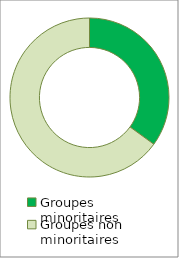
| Category | Series 0 |
|---|---|
| Groupes minoritaires | 0.35 |
| Groupes non minoritaires | 0.65 |